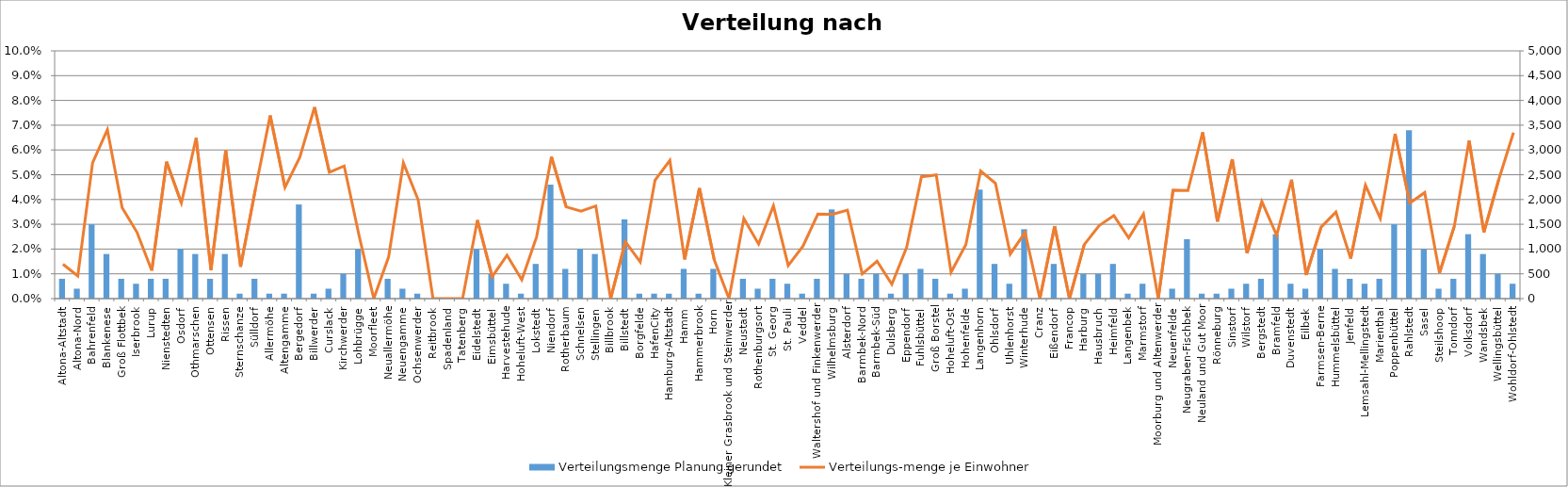
| Category | Verteilungsmenge Planung gerundet |
|---|---|
| Altona-Altstadt | 400 |
| Altona-Nord | 200 |
| Bahrenfeld | 1500 |
| Blankenese | 900 |
| Groß Flottbek | 400 |
| Iserbrook | 300 |
| Lurup | 400 |
| Nienstedten | 400 |
| Osdorf | 1000 |
| Othmarschen | 900 |
| Ottensen | 400 |
| Rissen | 900 |
| Sternschanze | 100 |
| Sülldorf | 400 |
| Allermöhe | 100 |
| Altengamme | 100 |
| Bergedorf | 1900 |
| Billwerder | 100 |
| Curslack | 200 |
| Kirchwerder | 500 |
| Lohbrügge | 1000 |
| Moorfleet | 0 |
| Neuallermöhe | 400 |
| Neuengamme | 200 |
| Ochsenwerder | 100 |
| Reitbrook | 0 |
| Spadenland | 0 |
| Tatenberg | 0 |
| Eidelstedt | 1000 |
| Eimsbüttel | 500 |
| Harvestehude | 300 |
| Hoheluft-West | 100 |
| Lokstedt | 700 |
| Niendorf | 2300 |
| Rotherbaum | 600 |
| Schnelsen | 1000 |
| Stellingen | 900 |
| Billbrook | 0 |
| Billstedt | 1600 |
| Borgfelde | 100 |
| HafenCity | 100 |
| Hamburg-Altstadt | 100 |
| Hamm | 600 |
| Hammerbrook | 100 |
| Horn | 600 |
| Kleiner Grasbrook und Steinwerder | 0 |
| Neustadt | 400 |
| Rothenburgsort | 200 |
| St. Georg | 400 |
| St. Pauli | 300 |
| Veddel | 100 |
| Waltershof und Finkenwerder | 400 |
| Wilhelmsburg | 1800 |
| Alsterdorf | 500 |
| Barmbek-Nord | 400 |
| Barmbek-Süd | 500 |
| Dulsberg | 100 |
| Eppendorf | 500 |
| Fuhlsbüttel | 600 |
| Groß Borstel | 400 |
| Hoheluft-Ost | 100 |
| Hohenfelde | 200 |
| Langenhorn | 2200 |
| Ohlsdorf | 700 |
| Uhlenhorst | 300 |
| Winterhude | 1400 |
| Cranz | 0 |
| Eißendorf | 700 |
| Francop | 0 |
| Harburg | 500 |
| Hausbruch | 500 |
| Heimfeld | 700 |
| Langenbek | 100 |
| Marmstorf | 300 |
| Moorburg und Altenwerder | 0 |
| Neuenfelde | 200 |
| Neugraben-Fischbek | 1200 |
| Neuland und Gut Moor | 100 |
| Rönneburg | 100 |
| Sinstorf | 200 |
| Wilstorf | 300 |
| Bergstedt | 400 |
| Bramfeld | 1300 |
| Duvenstedt | 300 |
| Eilbek | 200 |
| Farmsen-Berne | 1000 |
| Hummelsbüttel | 600 |
| Jenfeld | 400 |
| Lemsahl-Mellingstedt | 300 |
| Marienthal | 400 |
| Poppenbüttel | 1500 |
| Rahlstedt | 3400 |
| Sasel | 1000 |
| Steilshoop | 200 |
| Tonndorf | 400 |
| Volksdorf | 1300 |
| Wandsbek | 900 |
| Wellingsbüttel | 500 |
| Wohldorf-Ohlstedt | 300 |